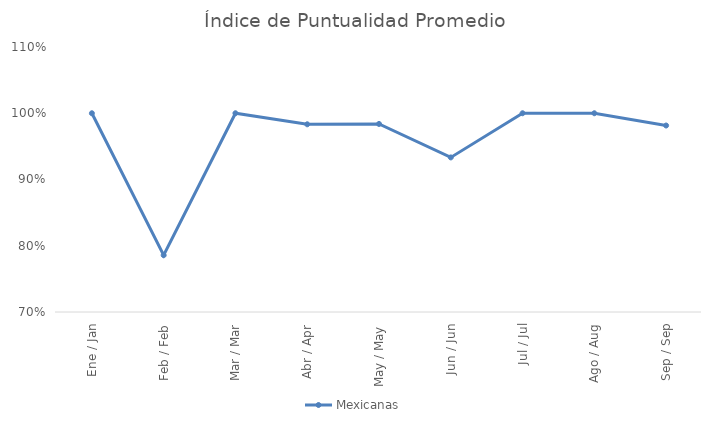
| Category | Mexicanas |
|---|---|
| Ene / Jan | 1 |
| Feb / Feb | 0.786 |
| Mar / Mar | 1 |
| Abr / Apr | 0.983 |
| May / May | 0.984 |
| Jun / Jun | 0.933 |
| Jul / Jul | 1 |
| Ago / Aug | 1 |
| Sep / Sep | 0.981 |